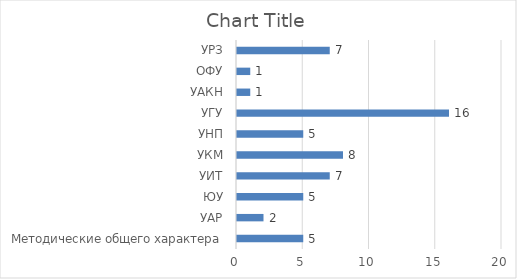
| Category | Series 0 |
|---|---|
| Методические общего характера | 5 |
| УАР | 2 |
| ЮУ | 5 |
| УИТ | 7 |
| УКМ | 8 |
| УНП | 5 |
| УГУ | 16 |
| УАКН | 1 |
| ОФУ | 1 |
| УРЗ | 7 |